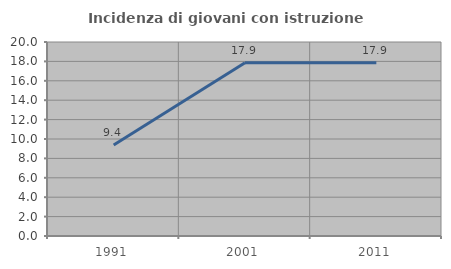
| Category | Incidenza di giovani con istruzione universitaria |
|---|---|
| 1991.0 | 9.375 |
| 2001.0 | 17.857 |
| 2011.0 | 17.857 |